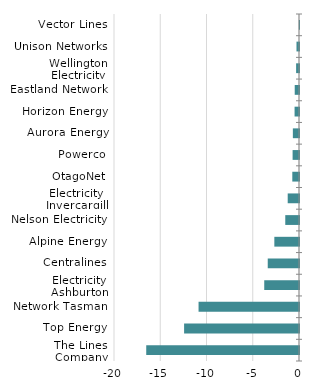
| Category | Series 0 |
|---|---|
| Vector Lines | -0.014 |
| Unison Networks | -0.272 |
| Wellington Electricity | -0.312 |
| Eastland Network | -0.463 |
| Horizon Energy | -0.479 |
| Aurora Energy | -0.665 |
| Powerco | -0.692 |
| OtagoNet | -0.724 |
| Electricity Invercargill | -1.221 |
| Nelson Electricity | -1.485 |
| Alpine Energy | -2.667 |
| Centralines | -3.379 |
| Electricity Ashburton | -3.758 |
| Network Tasman | -10.858 |
| Top Energy | -12.422 |
| The Lines Company | -16.515 |